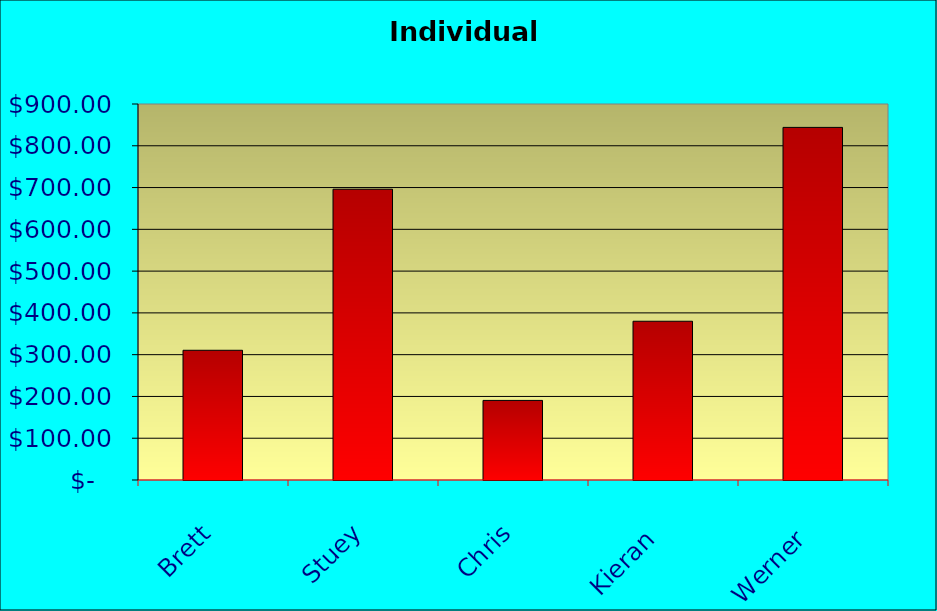
| Category | Series 0 |
|---|---|
| Brett | 310.5 |
| Stuey | 696 |
| Chris | 190.5 |
| Kieran | 380 |
| Werner | 844 |